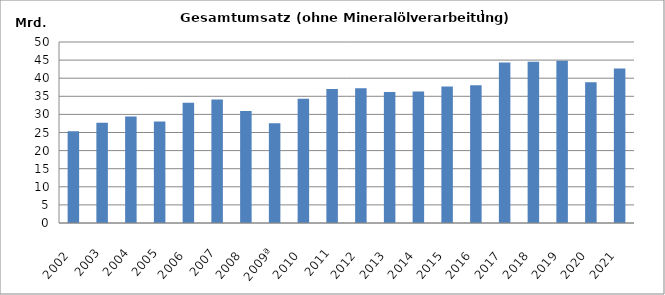
| Category | Series 1 |
|---|---|
| 2002  | 25322166.693 |
| 2003 | 27678709.853 |
| 2004 | 29399599.118 |
| 2005 | 28068624.714 |
| 2006  | 33185360.851 |
| 2007 | 34119646.051 |
| 2008  | 30915600.271 |
| 2009ª | 27521316.637 |
| 2010  | 34332768.486 |
| 2011 | 37004422.262 |
| 2012  | 37206235.695 |
| 2013  | 36200697.321 |
| 2014  | 36332803.449 |
| 2015  | 37693837.925 |
| 2016  | 38036870.621 |
| 2017  | 44327215.865 |
| 2018  | 44522389.348 |
| 2019  | 44820794.924 |
| 2020  | 38855651.718 |
| 2021  | 42649642.331 |